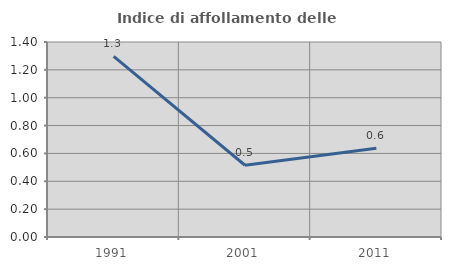
| Category | Indice di affollamento delle abitazioni  |
|---|---|
| 1991.0 | 1.297 |
| 2001.0 | 0.515 |
| 2011.0 | 0.637 |